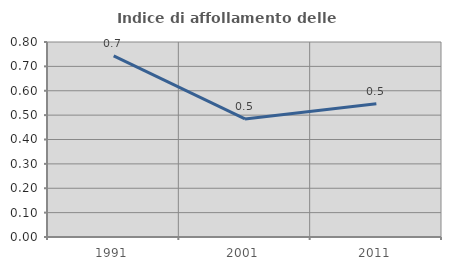
| Category | Indice di affollamento delle abitazioni  |
|---|---|
| 1991.0 | 0.743 |
| 2001.0 | 0.484 |
| 2011.0 | 0.546 |